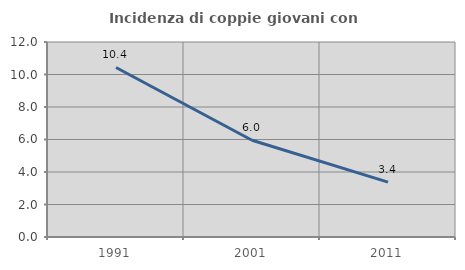
| Category | Incidenza di coppie giovani con figli |
|---|---|
| 1991.0 | 10.433 |
| 2001.0 | 5.955 |
| 2011.0 | 3.379 |